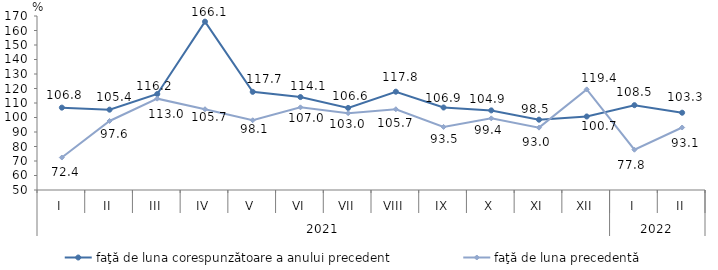
| Category | faţă de luna corespunzătoare a anului precedent | faţă de luna precedentă   |
|---|---|---|
| 0 | 106.8 | 72.4 |
| 1 | 105.4 | 97.6 |
| 2 | 116.2 | 113 |
| 3 | 166.1 | 105.7 |
| 4 | 117.7 | 98.1 |
| 5 | 114.1 | 107 |
| 6 | 106.6 | 103 |
| 7 | 117.8 | 105.7 |
| 8 | 106.9 | 93.5 |
| 9 | 104.9 | 99.4 |
| 10 | 98.5 | 93 |
| 11 | 100.7 | 119.4 |
| 12 | 108.5 | 77.8 |
| 13 | 103.3 | 93.1 |